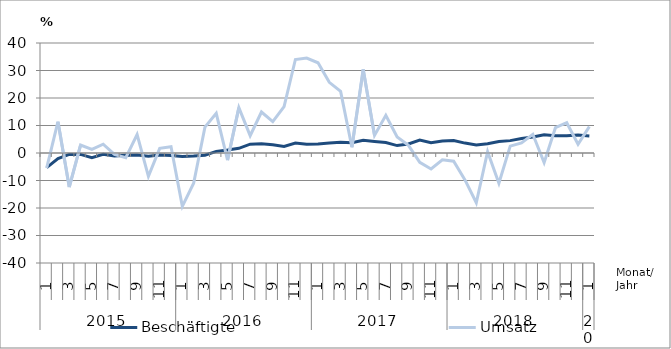
| Category | Beschäftigte | Umsatz |
|---|---|---|
| 0 | -5.3 | -5.5 |
| 1 | -2 | 11.4 |
| 2 | -0.5 | -12.4 |
| 3 | -0.5 | 2.9 |
| 4 | -1.7 | 1.3 |
| 5 | -0.5 | 3.2 |
| 6 | -1.1 | -0.5 |
| 7 | -0.8 | -1.7 |
| 8 | -0.7 | 6.7 |
| 9 | -1.2 | -8.5 |
| 10 | -0.7 | 1.7 |
| 11 | -0.9 | 2.3 |
| 12 | -1.3 | -19.4 |
| 13 | -1.1 | -11 |
| 14 | -0.8 | 9.4 |
| 15 | 0.6 | 14.4 |
| 16 | 1.1 | -2.6 |
| 17 | 1.7 | 16.5 |
| 18 | 3.2 | 6.3 |
| 19 | 3.4 | 14.9 |
| 20 | 3 | 11.4 |
| 21 | 2.4 | 16.9 |
| 22 | 3.6 | 34 |
| 23 | 3.2 | 34.5 |
| 24 | 3.3 | 32.8 |
| 25 | 3.6 | 25.7 |
| 26 | 3.9 | 22.4 |
| 27 | 3.7 | 2.1 |
| 28 | 4.6 | 30.4 |
| 29 | 4.2 | 6.4 |
| 30 | 3.8 | 13.7 |
| 31 | 2.7 | 5.8 |
| 32 | 3.3 | 2.8 |
| 33 | 4.7 | -3.4 |
| 34 | 3.7 | -5.8 |
| 35 | 4.4 | -2.5 |
| 36 | 4.5 | -3 |
| 37 | 3.6 | -9.8 |
| 38 | 2.9 | -18.1 |
| 39 | 3.4 | 0.5 |
| 40 | 4.2 | -11 |
| 41 | 4.5 | 2.5 |
| 42 | 5.3 | 3.7 |
| 43 | 5.8 | 6.8 |
| 44 | 6.6 | -3.5 |
| 45 | 6.3 | 9.2 |
| 46 | 6.3 | 11 |
| 47 | 6.5 | 3.2 |
| 48 | 6.2 | 9.6 |